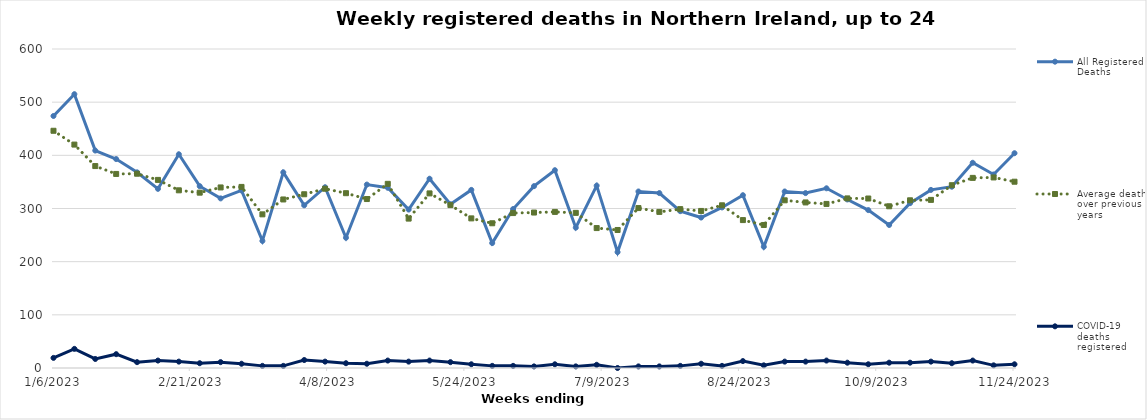
| Category | All Registered Deaths | Average deaths over previous 5 years | COVID-19 deaths registered |
|---|---|---|---|
| 1/6/23 | 474 | 446.2 | 19 |
| 1/13/23 | 515 | 420.2 | 36 |
| 1/20/23 | 409 | 379.8 | 17 |
| 1/27/23 | 393 | 365 | 26 |
| 2/3/23 | 368 | 365.4 | 11 |
| 2/10/23 | 337 | 353.8 | 14 |
| 2/17/23 | 402 | 334.2 | 12 |
| 2/24/23 | 342 | 329.8 | 9 |
| 3/3/23 | 319 | 339.6 | 11 |
| 3/10/23 | 334 | 340.6 | 8 |
| 3/17/23 | 239 | 289 | 4 |
| 3/24/23 | 368 | 317 | 4 |
| 3/31/23 | 306 | 326.8 | 15 |
| 4/7/23 | 340 | 337.2 | 12 |
| 4/14/23 | 245 | 328.8 | 9 |
| 4/21/23 | 345 | 317.8 | 8 |
| 4/28/23 | 339 | 346.4 | 14 |
| 5/5/23 | 298 | 281 | 12 |
| 5/12/23 | 356 | 328.4 | 14 |
| 5/19/23 | 308 | 306.4 | 11 |
| 5/26/23 | 335 | 281.4 | 7 |
| 6/2/23 | 235 | 272.2 | 4 |
| 6/9/23 | 299 | 291.4 | 4 |
| 6/16/23 | 342 | 292.4 | 3 |
| 6/23/23 | 372 | 293.6 | 7 |
| 6/30/23 | 264 | 291.8 | 3 |
| 7/7/23 | 343 | 263.2 | 6 |
| 7/14/23 | 218 | 259.6 | 0 |
| 7/21/23 | 332 | 300.8 | 3 |
| 7/28/23 | 329 | 293.6 | 3 |
| 8/4/23 | 295 | 298.8 | 4 |
| 8/11/23 | 283 | 295.4 | 8 |
| 8/18/23 | 302 | 306 | 4 |
| 8/25/23 | 325 | 278.2 | 13 |
| 9/1/23 | 228 | 269 | 5 |
| 9/8/23 | 332 | 315.4 | 12 |
| 9/15/23 | 329 | 311.4 | 12 |
| 9/22/23 | 338 | 308.6 | 14 |
| 9/29/23 | 317 | 319 | 10 |
| 10/6/23 | 297 | 318.8 | 7 |
| 10/13/23 | 269 | 304.2 | 10 |
| 10/20/23 | 310 | 315.4 | 10 |
| 10/27/23 | 335 | 316.2 | 12 |
| 11/3/23 | 341 | 343.8 | 9 |
| 11/10/23 | 386 | 357.6 | 14 |
| 11/17/23 | 364 | 358.4 | 5 |
| 11/24/23 | 404 | 350.4 | 7 |